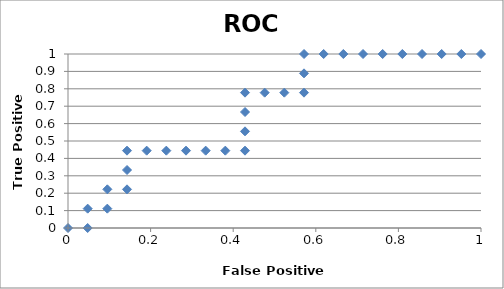
| Category | Series 0 |
|---|---|
| 1.0 | 1 |
| 0.9523809523809523 | 1 |
| 0.9047619047619048 | 1 |
| 0.8571428571428572 | 1 |
| 0.8095238095238095 | 1 |
| 0.7619047619047619 | 1 |
| 0.7142857142857143 | 1 |
| 0.6666666666666667 | 1 |
| 0.6190476190476191 | 1 |
| 0.5714285714285714 | 1 |
| 0.5714285714285714 | 0.889 |
| 0.5714285714285714 | 0.778 |
| 0.5238095238095238 | 0.778 |
| 0.47619047619047616 | 0.778 |
| 0.4285714285714286 | 0.778 |
| 0.4285714285714286 | 0.667 |
| 0.4285714285714286 | 0.556 |
| 0.4285714285714286 | 0.444 |
| 0.38095238095238093 | 0.444 |
| 0.33333333333333337 | 0.444 |
| 0.2857142857142857 | 0.444 |
| 0.23809523809523814 | 0.444 |
| 0.19047619047619047 | 0.444 |
| 0.1428571428571429 | 0.444 |
| 0.1428571428571429 | 0.333 |
| 0.1428571428571429 | 0.222 |
| 0.09523809523809523 | 0.222 |
| 0.09523809523809523 | 0.111 |
| 0.04761904761904767 | 0.111 |
| 0.04761904761904767 | 0 |
| 0.0 | 0 |